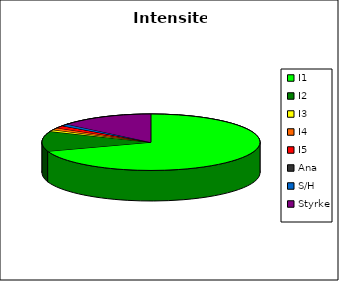
| Category | Intensitet |
|---|---|
| I1 | 1433 |
| I2 | 235 |
| I3 | 20 |
| I4 | 25 |
| I5 | 30 |
| Ana | 0 |
| S/H | 22 |
| Styrke | 287 |